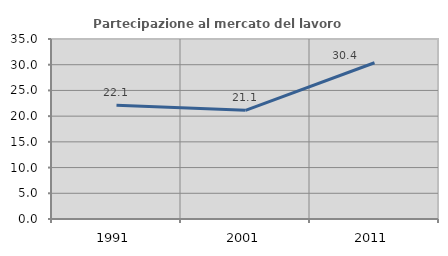
| Category | Partecipazione al mercato del lavoro  femminile |
|---|---|
| 1991.0 | 22.137 |
| 2001.0 | 21.127 |
| 2011.0 | 30.387 |